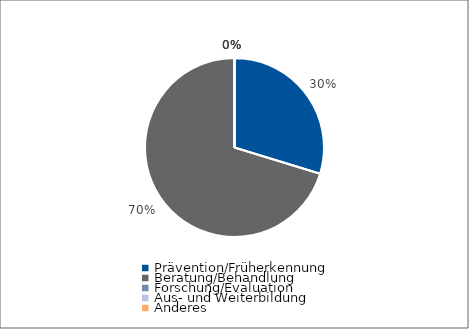
| Category | Series 0 |
|---|---|
| Prävention/Früherkennung | 4232 |
| Beratung/Behandlung | 10000 |
| Forschung/Evaluation | 0 |
| Aus- und Weiterbildung | 0 |
| Anderes | 0 |